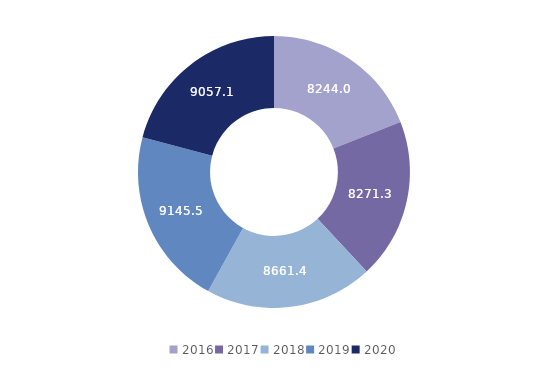
| Category | Series 0 |
|---|---|
| 2016.0 | 8244 |
| 2017.0 | 8271.3 |
| 2018.0 | 8661.4 |
| 2019.0 | 9145.5 |
| 2020.0 | 9057.1 |